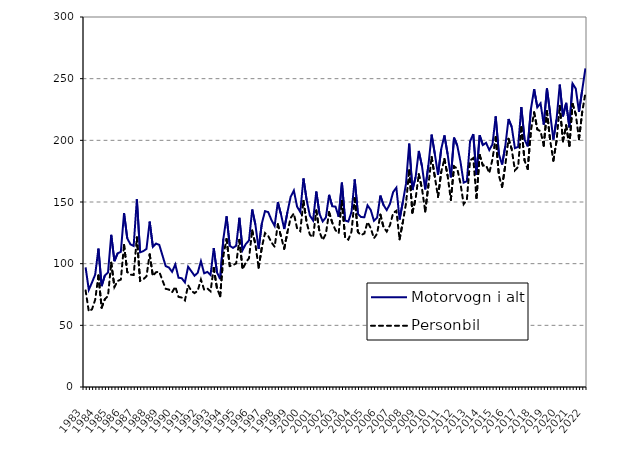
| Category | Motorvogn i alt | Personbil |
|---|---|---|
| 1983.0 | 97 | 78.3 |
| nan | 78.8 | 61.3 |
| nan | 84.8 | 63 |
| nan | 91.2 | 70.8 |
| 1984.0 | 112.2 | 90.4 |
| nan | 81.8 | 64.4 |
| nan | 90.4 | 71.1 |
| nan | 92.9 | 73.9 |
| 1985.0 | 123.4 | 100.8 |
| nan | 102 | 81.1 |
| nan | 108.4 | 86 |
| nan | 109.6 | 87.1 |
| 1986.0 | 141 | 115.2 |
| nan | 120.5 | 93.2 |
| nan | 115.7 | 91.1 |
| nan | 114.4 | 90.8 |
| 1987.0 | 152.2 | 121.3 |
| nan | 109.2 | 86.1 |
| nan | 110.1 | 87.3 |
| nan | 112 | 89.8 |
| 1988.0 | 134.1 | 107.5 |
| nan | 113.7 | 90 |
| nan | 116.3 | 93.1 |
| nan | 115.2 | 93.4 |
| 1989.0 | 106.6 | 86.4 |
| nan | 98 | 79.6 |
| nan | 96.9 | 79 |
| nan | 93.4 | 76.8 |
| 1990.0 | 99.4 | 81.3 |
| nan | 88.6 | 73.1 |
| nan | 88.2 | 72.5 |
| nan | 84.8 | 70.2 |
| 1991.0 | 97.5 | 82.4 |
| nan | 93.9 | 78 |
| nan | 90.2 | 76.1 |
| nan | 92.6 | 78.1 |
| 1992.0 | 102 | 87.1 |
| nan | 92.2 | 78.9 |
| nan | 93.3 | 79.9 |
| nan | 90.8 | 77.6 |
| 1993.0 | 112.6 | 96.5 |
| nan | 93 | 80.1 |
| nan | 87.5 | 73.6 |
| nan | 120.1 | 106.6 |
| 1994.0 | 138.4 | 120 |
| nan | 114.5 | 98.1 |
| nan | 112.8 | 98.8 |
| nan | 114.5 | 100.2 |
| 1995.0 | 137.2 | 119.3 |
| nan | 111 | 95.4 |
| nan | 115.9 | 101 |
| nan | 118.8 | 104.4 |
| 1996.0 | 143.9 | 126.9 |
| nan | 131.6 | 115.7 |
| nan | 112 | 96.7 |
| nan | 132.5 | 113.1 |
| 1997.0 | 142.6 | 124.8 |
| nan | 141.8 | 122.5 |
| nan | 135.4 | 117.3 |
| nan | 130.6 | 113.7 |
| 1998.0 | 150 | 131.9 |
| nan | 139.8 | 122 |
| nan | 128.1 | 112.1 |
| nan | 141.8 | 125.6 |
| 1999.0 | 154.2 | 137.1 |
| nan | 159.3 | 140.7 |
| nan | 146.3 | 128.7 |
| nan | 141.9 | 126.4 |
| 2000.0 | 169.1 | 150.9 |
| nan | 151.5 | 133.4 |
| nan | 139 | 123.5 |
| nan | 135.1 | 121.4 |
| 2001.0 | 158.5 | 143.1 |
| nan | 140.46 | 125.7 |
| nan | 134.24 | 119.2 |
| nan | 137.495 | 124.072 |
| 2002.0 | 155.814 | 141.724 |
| nan | 146.543 | 133.19 |
| nan | 146.231 | 127.141 |
| nan | 137.967 | 124.641 |
| 2003.0 | 165.679 | 150.811 |
| nan | 135.021 | 121.101 |
| nan | 134.111 | 119.491 |
| nan | 142.013 | 125.959 |
| 2004.0 | 168.309 | 153.043 |
| nan | 140.267 | 125.568 |
| nan | 137.77 | 123.121 |
| nan | 137.685 | 124.506 |
| 2005.0 | 147.311 | 133.756 |
| nan | 143.517 | 128.79 |
| nan | 134.783 | 120.571 |
| nan | 137.37 | 124.382 |
| 2006.0 | 155.213 | 139.728 |
| nan | 147.444 | 129.572 |
| nan | 143.451 | 126.006 |
| nan | 148.561 | 131.195 |
| 2007.0 | 158.1 | 141.084 |
| nan | 161.613 | 142.897 |
| nan | 135.821 | 119.753 |
| nan | 149.791 | 133.498 |
| 2008.0 | 164.642 | 148.614 |
| nan | 197.287 | 175.714 |
| nan | 159.718 | 141.407 |
| nan | 170.057 | 152.54 |
| 2009.0 | 191.38 | 172.559 |
| nan | 178.906 | 160.765 |
| nan | 160.234 | 142.312 |
| nan | 179.857 | 163.532 |
| 2010.0 | 204.636 | 186.507 |
| nan | 188.957 | 170.463 |
| nan | 172.077 | 154.156 |
| nan | 192.961 | 174.399 |
| 2011.0 | 204.005 | 184.86 |
| nan | 188.741 | 171.333 |
| nan | 169.934 | 151.694 |
| nan | 202.176 | 178.919 |
| 2012.0 | 195.829 | 177.072 |
| nan | 182.751 | 165.128 |
| nan | 165.73 | 148.242 |
| nan | 166.805 | 151.728 |
| 2013.0 | 199.181 | 183.653 |
| nan | 205.015 | 185.634 |
| nan | 172.044 | 153.21 |
| nan | 204.1 | 188.079 |
| 2014.0 | 196.177 | 179.552 |
| nan | 197.965 | 179.767 |
| nan | 192.105 | 173.474 |
| nan | 196.809 | 184.739 |
| 2015.0 | 219.419 | 202.592 |
| nan | 188.696 | 171.451 |
| nan | 180.388 | 162.297 |
| nan | 195.23 | 179.891 |
| 2016.0 | 217.298 | 201.197 |
| nan | 210.949 | 192.893 |
| nan | 193.648 | 175.642 |
| nan | 194.663 | 178.455 |
| 2017.0 | 227.029 | 210.738 |
| nan | 200.767 | 183.708 |
| nan | 195.059 | 176.766 |
| nan | 225.423 | 208.218 |
| 2018.0 | 241.528 | 222.678 |
| nan | 226.771 | 208.839 |
| nan | 230.044 | 207.395 |
| nan | 212.667 | 195.666 |
| 2019.0 | 242.056 | 223.584 |
| nan | 221.711 | 199.972 |
| nan | 200.668 | 183.518 |
| nan | 216.92 | 199.72 |
| 2020.0 | 245.163 | 227.947 |
| nan | 219.434 | 199.239 |
| nan | 230.409 | 212.039 |
| nan | 210.538 | 195.423 |
| 2021.0 | 246.037 | 229.482 |
| nan | 241.941 | 221.096 |
| nan | 223.162 | 200.95 |
| nan | 240.674 | 222.834 |
| 2022.0 | 258.319 | 238.379 |